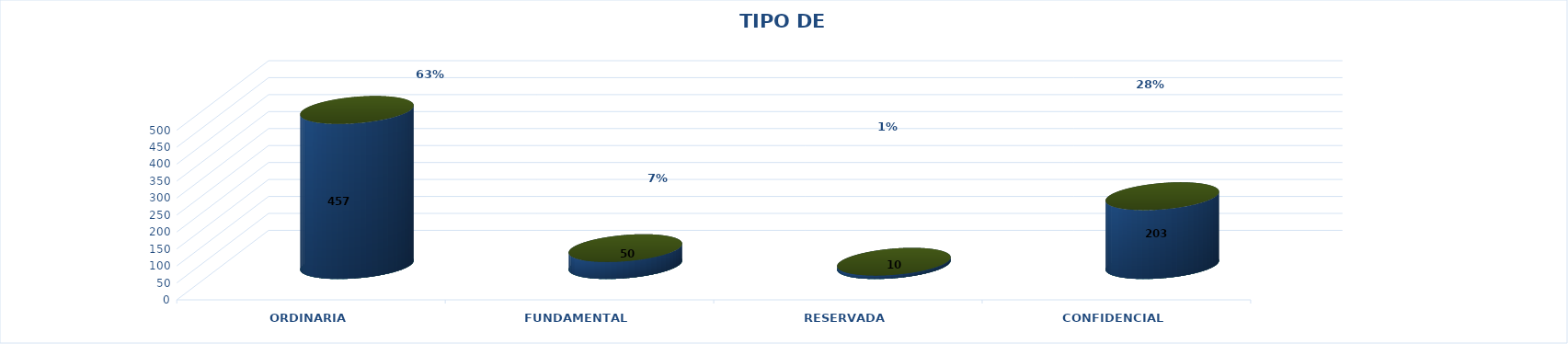
| Category | Series 0 | Series 2 | Series 1 | Series 3 | Series 4 |
|---|---|---|---|---|---|
| ORDINARIA |  |  |  | 457 | 0.635 |
| FUNDAMENTAL |  |  |  | 50 | 0.069 |
| RESERVADA |  |  |  | 10 | 0.014 |
| CONFIDENCIAL |  |  |  | 203 | 0.282 |